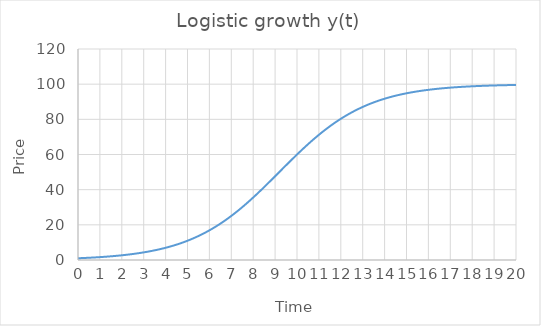
| Category | Series 0 |
|---|---|
| 0.0 | 1 |
| 0.2 | 1.104 |
| 0.4 | 1.219 |
| 0.6000000000000001 | 1.345 |
| 0.8 | 1.485 |
| 1.0 | 1.638 |
| 1.2 | 1.807 |
| 1.4 | 1.994 |
| 1.5999999999999999 | 2.199 |
| 1.7999999999999998 | 2.424 |
| 1.9999999999999998 | 2.672 |
| 2.1999999999999997 | 2.945 |
| 2.4 | 3.245 |
| 2.6 | 3.574 |
| 2.8000000000000003 | 3.935 |
| 3.0000000000000004 | 4.331 |
| 3.2000000000000006 | 4.765 |
| 3.400000000000001 | 5.24 |
| 3.600000000000001 | 5.759 |
| 3.800000000000001 | 6.326 |
| 4.000000000000001 | 6.945 |
| 4.200000000000001 | 7.62 |
| 4.400000000000001 | 8.355 |
| 4.600000000000001 | 9.153 |
| 4.800000000000002 | 10.019 |
| 5.000000000000002 | 10.957 |
| 5.200000000000002 | 11.972 |
| 5.400000000000002 | 13.066 |
| 5.600000000000002 | 14.245 |
| 5.8000000000000025 | 15.51 |
| 6.000000000000003 | 16.866 |
| 6.200000000000003 | 18.315 |
| 6.400000000000003 | 19.859 |
| 6.600000000000003 | 21.499 |
| 6.800000000000003 | 23.234 |
| 7.0000000000000036 | 25.066 |
| 7.200000000000004 | 26.99 |
| 7.400000000000004 | 29.005 |
| 7.600000000000004 | 31.107 |
| 7.800000000000004 | 33.29 |
| 8.000000000000004 | 35.546 |
| 8.200000000000003 | 37.869 |
| 8.400000000000002 | 40.249 |
| 8.600000000000001 | 42.675 |
| 8.8 | 45.137 |
| 9.0 | 47.624 |
| 9.2 | 50.122 |
| 9.399999999999999 | 52.62 |
| 9.599999999999998 | 55.104 |
| 9.799999999999997 | 57.564 |
| 9.999999999999996 | 59.986 |
| 10.199999999999996 | 62.361 |
| 10.399999999999995 | 64.677 |
| 10.599999999999994 | 66.927 |
| 10.799999999999994 | 69.102 |
| 10.999999999999993 | 71.195 |
| 11.199999999999992 | 73.202 |
| 11.399999999999991 | 75.117 |
| 11.59999999999999 | 76.939 |
| 11.79999999999999 | 78.666 |
| 11.99999999999999 | 80.296 |
| 12.199999999999989 | 81.83 |
| 12.399999999999988 | 83.27 |
| 12.599999999999987 | 84.617 |
| 12.799999999999986 | 85.874 |
| 12.999999999999986 | 87.044 |
| 13.199999999999985 | 88.131 |
| 13.399999999999984 | 89.138 |
| 13.599999999999984 | 90.069 |
| 13.799999999999983 | 90.928 |
| 13.999999999999982 | 91.72 |
| 14.199999999999982 | 92.448 |
| 14.39999999999998 | 93.117 |
| 14.59999999999998 | 93.731 |
| 14.79999999999998 | 94.294 |
| 14.999999999999979 | 94.809 |
| 15.199999999999978 | 95.279 |
| 15.399999999999977 | 95.709 |
| 15.599999999999977 | 96.102 |
| 15.799999999999976 | 96.46 |
| 15.999999999999975 | 96.786 |
| 16.199999999999974 | 97.083 |
| 16.399999999999974 | 97.353 |
| 16.599999999999973 | 97.599 |
| 16.799999999999972 | 97.822 |
| 16.99999999999997 | 98.025 |
| 17.19999999999997 | 98.21 |
| 17.39999999999997 | 98.378 |
| 17.59999999999997 | 98.53 |
| 17.79999999999997 | 98.668 |
| 17.999999999999968 | 98.793 |
| 18.199999999999967 | 98.907 |
| 18.399999999999967 | 99.01 |
| 18.599999999999966 | 99.103 |
| 18.799999999999965 | 99.188 |
| 18.999999999999964 | 99.264 |
| 19.199999999999964 | 99.334 |
| 19.399999999999963 | 99.397 |
| 19.599999999999962 | 99.454 |
| 19.79999999999996 | 99.506 |
| 19.99999999999996 | 99.553 |